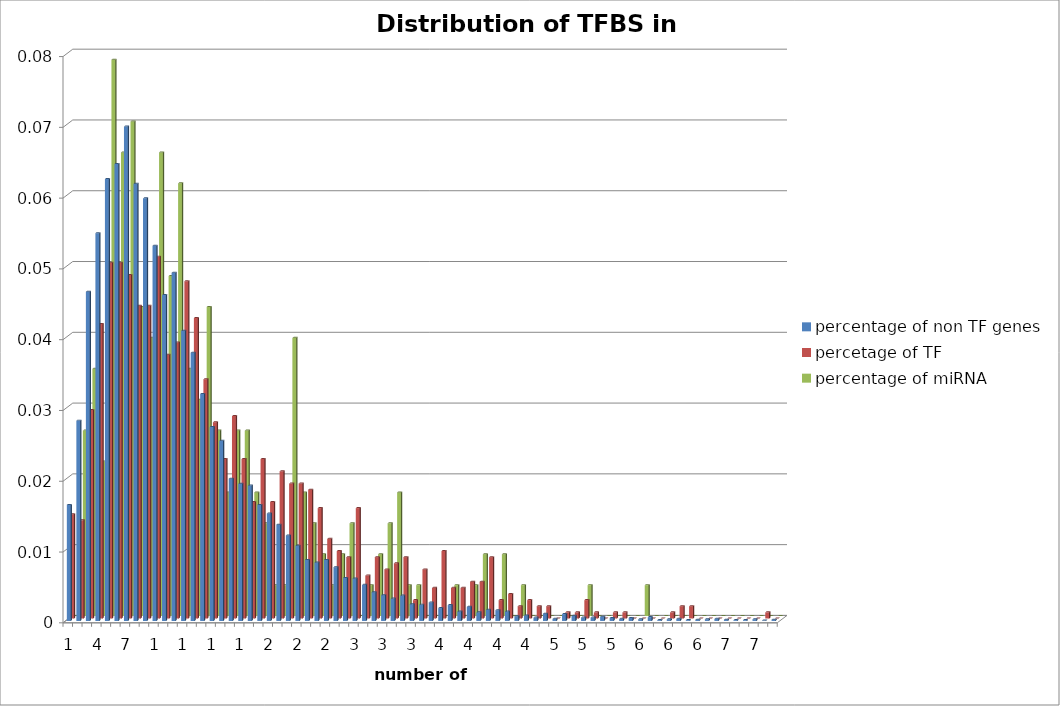
| Category | percentage of non TF genes | percetage of TF | percentage of miRNA |
|---|---|---|---|
| 0 | 0.016 | 0.015 | 0 |
| 1 | 0.028 | 0.014 | 0.026 |
| 2 | 0.047 | 0.029 | 0.035 |
| 3 | 0.055 | 0.042 | 0.022 |
| 4 | 0.062 | 0.05 | 0.079 |
| 5 | 0.065 | 0.05 | 0.066 |
| 6 | 0.07 | 0.049 | 0.07 |
| 7 | 0.062 | 0.044 | 0.044 |
| 8 | 0.06 | 0.044 | 0.039 |
| 9 | 0.053 | 0.051 | 0.066 |
| 10 | 0.046 | 0.037 | 0.048 |
| 11 | 0.049 | 0.039 | 0.061 |
| 12 | 0.041 | 0.048 | 0.035 |
| 13 | 0.038 | 0.042 | 0.031 |
| 14 | 0.032 | 0.034 | 0.044 |
| 15 | 0.027 | 0.028 | 0.026 |
| 16 | 0.025 | 0.023 | 0.017 |
| 17 | 0.02 | 0.029 | 0.026 |
| 18 | 0.019 | 0.023 | 0.026 |
| 19 | 0.019 | 0.016 | 0.017 |
| 20 | 0.016 | 0.023 | 0.013 |
| 21 | 0.015 | 0.016 | 0.004 |
| 22 | 0.014 | 0.021 | 0.004 |
| 23 | 0.012 | 0.019 | 0.039 |
| 24 | 0.011 | 0.019 | 0.017 |
| 25 | 0.009 | 0.018 | 0.013 |
| 26 | 0.008 | 0.016 | 0.009 |
| 27 | 0.009 | 0.011 | 0.004 |
| 28 | 0.008 | 0.01 | 0.009 |
| 29 | 0.006 | 0.009 | 0.013 |
| 30 | 0.006 | 0.016 | 0 |
| 31 | 0.005 | 0.006 | 0.004 |
| 32 | 0.004 | 0.009 | 0.009 |
| 33 | 0.004 | 0.007 | 0.013 |
| 34 | 0.003 | 0.008 | 0.017 |
| 35 | 0.004 | 0.009 | 0.004 |
| 36 | 0.002 | 0.003 | 0.004 |
| 37 | 0.002 | 0.007 | 0 |
| 38 | 0.003 | 0.004 | 0 |
| 39 | 0.002 | 0.01 | 0 |
| 40 | 0.002 | 0.004 | 0.004 |
| 41 | 0.001 | 0.004 | 0 |
| 42 | 0.002 | 0.005 | 0.004 |
| 43 | 0.001 | 0.005 | 0.009 |
| 44 | 0.002 | 0.009 | 0 |
| 45 | 0.002 | 0.003 | 0.009 |
| 46 | 0.001 | 0.003 | 0 |
| 47 | 0.001 | 0.002 | 0.004 |
| 48 | 0.001 | 0.003 | 0 |
| 49 | 0 | 0.002 | 0 |
| 50 | 0.001 | 0.002 | 0 |
| 51 | 0 | 0 | 0 |
| 52 | 0.001 | 0.001 | 0 |
| 53 | 0.001 | 0.001 | 0 |
| 54 | 0 | 0.003 | 0.004 |
| 55 | 0 | 0.001 | 0 |
| 56 | 0.001 | 0 | 0 |
| 57 | 0 | 0.001 | 0 |
| 58 | 0 | 0.001 | 0 |
| 59 | 0 | 0 | 0 |
| 60 | 0 | 0 | 0.004 |
| 61 | 0.001 | 0 | 0 |
| 62 | 0 | 0 | 0 |
| 63 | 0 | 0.001 | 0 |
| 64 | 0 | 0.002 | 0 |
| 65 | 0 | 0.002 | 0 |
| 66 | 0 | 0 | 0 |
| 67 | 0 | 0 | 0 |
| 68 | 0 | 0 | 0 |
| 69 | 0 | 0 | 0 |
| 70 | 0 | 0 | 0 |
| 71 | 0 | 0 | 0 |
| 72 | 0 | 0 | 0 |
| 73 | 0 | 0.001 | 0 |
| 74 | 0 | 0 | 0 |